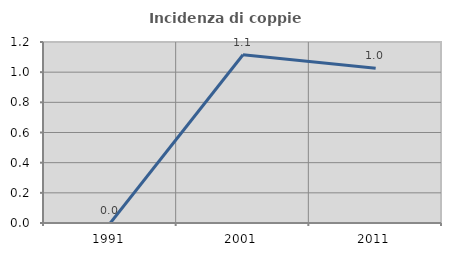
| Category | Incidenza di coppie miste |
|---|---|
| 1991.0 | 0 |
| 2001.0 | 1.116 |
| 2011.0 | 1.026 |